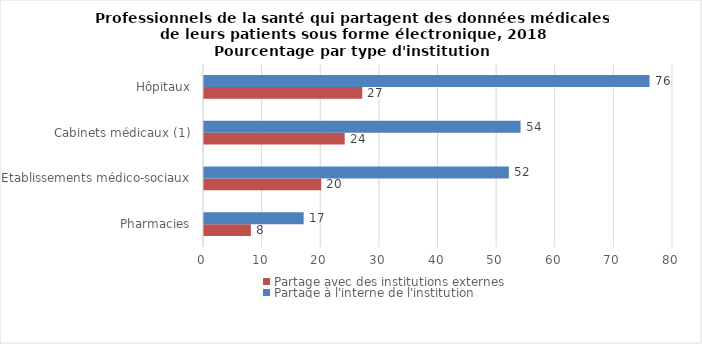
| Category | Partage avec des institutions externes | Partage à l'interne de l'institution |
|---|---|---|
| Pharmacies | 8 | 17 |
| Etablissements médico-sociaux | 20 | 52 |
| Cabinets médicaux (1) | 24 | 54 |
| Hôpitaux | 27 | 76 |